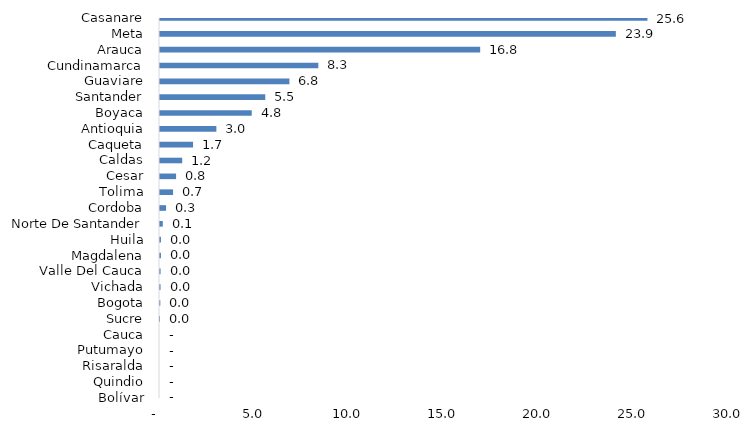
| Category | Series 0 |
|---|---|
| Bolívar | 0 |
| Quindio | 0 |
| Risaralda | 0 |
| Putumayo | 0 |
| Cauca | 0 |
| Sucre | 0.001 |
| Bogota | 0.018 |
| Vichada | 0.029 |
| Valle Del Cauca | 0.031 |
| Magdalena | 0.049 |
| Huila | 0.049 |
| Norte De Santander | 0.146 |
| Cordoba | 0.32 |
| Tolima | 0.685 |
| Cesar | 0.845 |
| Caldas | 1.168 |
| Caqueta | 1.738 |
| Antioquia | 2.962 |
| Boyaca | 4.82 |
| Santander | 5.531 |
| Guaviare | 6.8 |
| Cundinamarca | 8.318 |
| Arauca | 16.822 |
| Meta | 23.95 |
| Casanare | 25.611 |